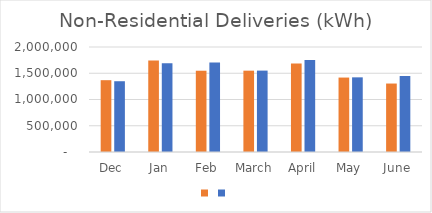
| Category | Series 1 | Series 0 |
|---|---|---|
| Dec | 1367905 | 1348000 |
| Jan | 1741151 | 1691318 |
| Feb | 1548063 | 1705422 |
| March | 1549153 | 1550355 |
| April | 1684677 | 1750598 |
| May | 1417925 | 1421957 |
| June | 1304116 | 1447306 |